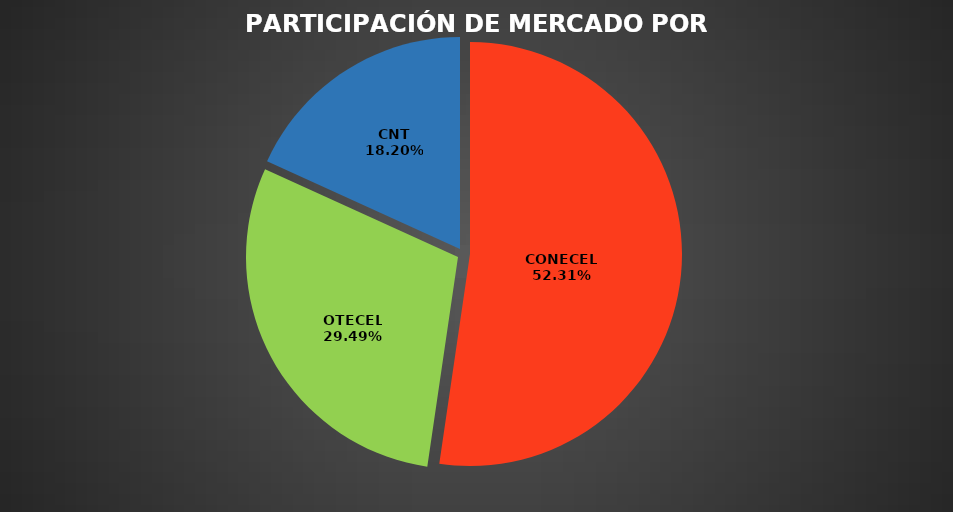
| Category | Abr2024 |
|---|---|
| CONECEL | 9547573 |
| OTECEL | 5381714 |
| CNT | 3321223 |